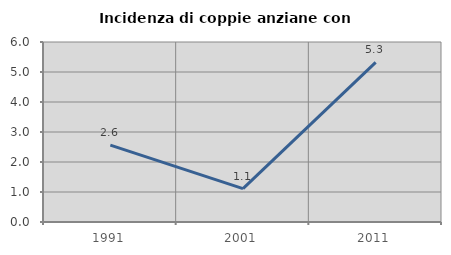
| Category | Incidenza di coppie anziane con figli |
|---|---|
| 1991.0 | 2.564 |
| 2001.0 | 1.111 |
| 2011.0 | 5.319 |